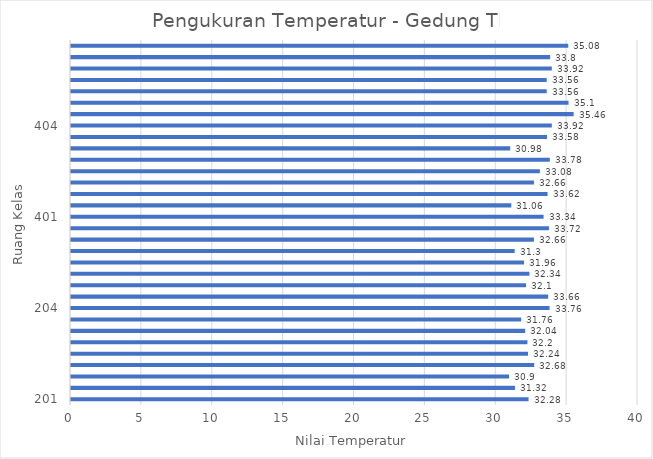
| Category | Series 0 |
|---|---|
| 201.0 | 32.28 |
| nan | 31.32 |
| nan | 30.9 |
| nan | 32.68 |
| nan | 32.24 |
| nan | 32.2 |
| nan | 32.04 |
| nan | 31.76 |
| 204.0 | 33.76 |
| nan | 33.66 |
| nan | 32.1 |
| nan | 32.34 |
| nan | 31.96 |
| nan | 31.3 |
| nan | 32.66 |
| nan | 33.72 |
| 401.0 | 33.34 |
| nan | 31.06 |
| nan | 33.62 |
| nan | 32.66 |
| nan | 33.08 |
| nan | 33.78 |
| nan | 30.98 |
| nan | 33.58 |
| 404.0 | 33.92 |
| nan | 35.46 |
| nan | 35.1 |
| nan | 33.56 |
| nan | 33.56 |
| nan | 33.92 |
| nan | 33.8 |
| nan | 35.08 |